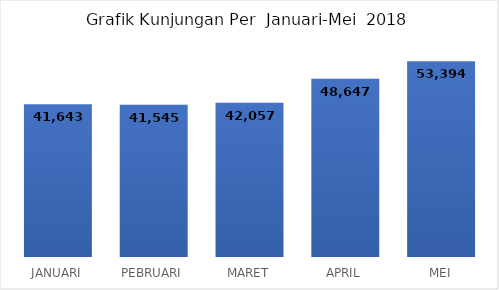
| Category |  41,643  |
|---|---|
| JANUARI | 41643 |
| PEBRUARI | 41545 |
| MARET | 42057 |
| APRIL | 48647 |
| MEI | 53394 |